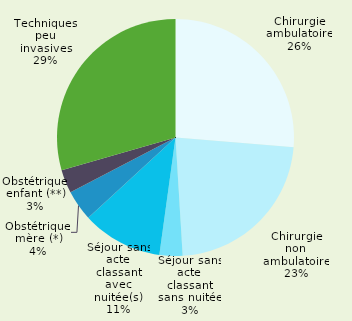
| Category | Series 0 |
|---|---|
| Chirurgie ambulatoire | 0.263 |
| Chirurgie non ambulatoire | 0.227 |
| Séjour sans acte classant sans nuitée | 0.031 |
| Séjour sans acte classant avec nuitée(s) | 0.11 |
| Obstétrique mère (*) | 0.042 |
| Obstétrique enfant (**) | 0.032 |
| Techniques peu invasives | 0.294 |